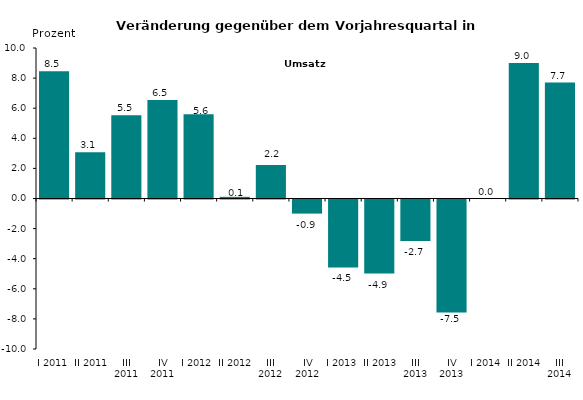
| Category | Series 0 |
|---|---|
| I 2011 | 8.452 |
| II 2011 | 3.069 |
| III 2011 | 5.528 |
| IV 2011 | 6.549 |
| I 2012 | 5.603 |
| II 2012 | 0.11 |
| III 2012 | 2.228 |
| IV 2012 | -0.936 |
| I 2013 | -4.513 |
| II 2013 | -4.922 |
| III 2013 | -2.749 |
| IV 2013 | -7.5 |
| I 2014 | 0 |
| II 2014 | 9 |
| III 2014 | 7.7 |